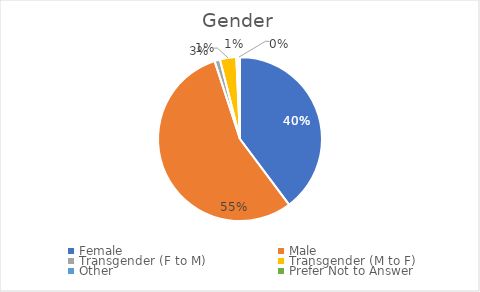
| Category | Series 0 |
|---|---|
| Female | 111 |
| Male | 154 |
| Transgender (F to M) | 3 |
| Transgender (M to F) | 9 |
| Other | 1 |
| Prefer Not to Answer | 1 |